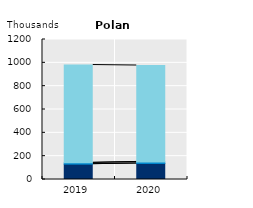
| Category | International seasonal workers | Working holidaymakers | Intra-company transferees | International trainees | Other temporary migrant workers |
|---|---|---|---|---|---|
| 2019.0 | 131.446 |  | 11.267 |  | 838.54 |
| 2020.0 | 137.403 |  | 12.873 |  | 826.7 |